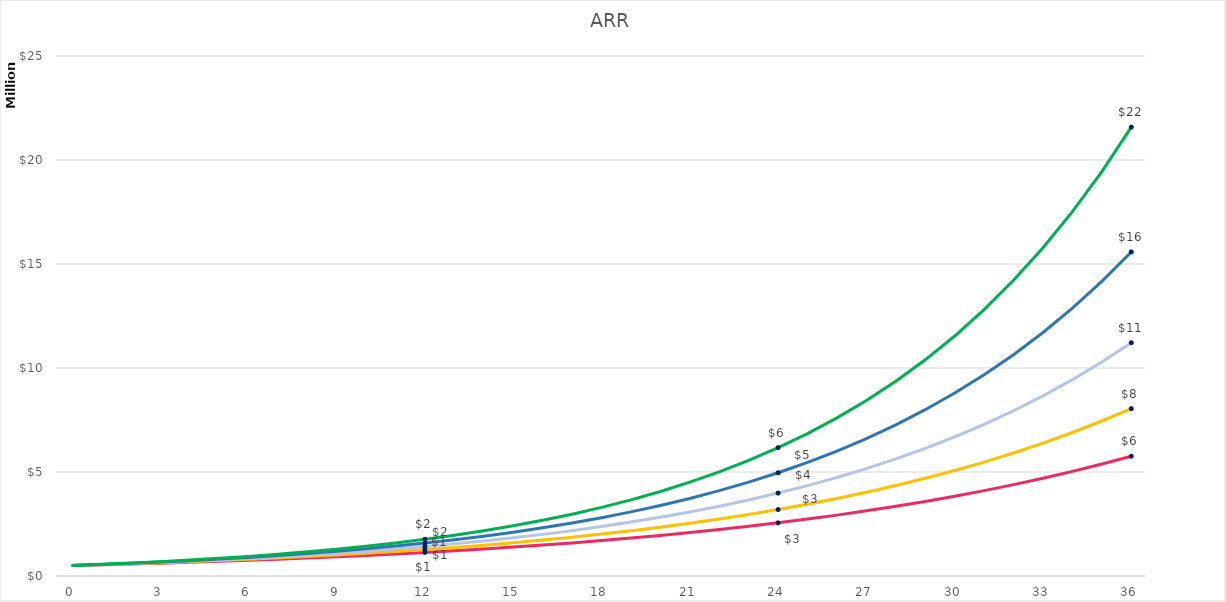
| Category | Series 1 | Series 2 | Series 0 | Series 3 | Series 4 |
|---|---|---|---|---|---|
| 0.0 | 504000 | 504000 | 504000 | 504000 | 504000 |
| 1.0 | 539280 | 544320 | 549360 | 554400 | 559440 |
| 2.0 | 577029.6 | 587865.6 | 598802.4 | 609840 | 620978.4 |
| 3.0 | 617421.672 | 634894.848 | 652694.616 | 670824 | 689286.024 |
| 4.0 | 660641.189 | 685686.436 | 711437.131 | 737906.4 | 765107.487 |
| 5.0 | 706886.072 | 740541.351 | 775466.473 | 811697.04 | 849269.31 |
| 6.0 | 756368.097 | 799784.659 | 845258.456 | 892866.744 | 942688.934 |
| 7.0 | 809313.864 | 863767.431 | 921331.717 | 982153.418 | 1046384.717 |
| 8.0 | 865965.835 | 932868.826 | 1004251.571 | 1080368.76 | 1161487.036 |
| 9.0 | 926583.443 | 1007498.332 | 1094634.213 | 1188405.636 | 1289250.61 |
| 10.0 | 991444.284 | 1088098.199 | 1193151.292 | 1307246.2 | 1431068.177 |
| 11.0 | 1060845.384 | 1175146.055 | 1300534.908 | 1437970.82 | 1588485.676 |
| 12.0 | 1135104.561 | 1269157.739 | 1417583.05 | 1581767.902 | 1763219.101 |
| 13.0 | 1214561.88 | 1370690.358 | 1545165.525 | 1739944.692 | 1957173.202 |
| 14.0 | 1299581.212 | 1480345.587 | 1684230.422 | 1913939.161 | 2172462.254 |
| 15.0 | 1390551.897 | 1598773.234 | 1835811.16 | 2105333.077 | 2411433.102 |
| 16.0 | 1487890.529 | 1726675.092 | 2001034.164 | 2315866.385 | 2676690.743 |
| 17.0 | 1592042.866 | 1864809.1 | 2181127.239 | 2547453.024 | 2971126.725 |
| 18.0 | 1703485.867 | 2013993.828 | 2377428.69 | 2802198.326 | 3297950.665 |
| 19.0 | 1822729.878 | 2175113.334 | 2591397.272 | 3082418.159 | 3660725.238 |
| 20.0 | 1950320.969 | 2349122.401 | 2824623.027 | 3390659.974 | 4063405.014 |
| 21.0 | 2086843.437 | 2537052.193 | 3078839.099 | 3729725.972 | 4510379.566 |
| 22.0 | 2232922.478 | 2740016.368 | 3355934.618 | 4102698.569 | 5006521.318 |
| 23.0 | 2389227.051 | 2959217.677 | 3657968.734 | 4512968.426 | 5557238.663 |
| 24.0 | 2556472.945 | 3195955.092 | 3987185.92 | 4964265.269 | 6168534.916 |
| 25.0 | 2735426.051 | 3451631.499 | 4346032.653 | 5460691.795 | 6847073.757 |
| 26.0 | 2926905.874 | 3727762.019 | 4737175.592 | 6006760.975 | 7600251.87 |
| 27.0 | 3131789.285 | 4025982.98 | 5163521.395 | 6607437.073 | 8436279.576 |
| 28.0 | 3351014.535 | 4348061.619 | 5628238.32 | 7268180.78 | 9364270.329 |
| 29.0 | 3585585.553 | 4695906.548 | 6134779.769 | 7994998.858 | 10394340.065 |
| 30.0 | 3836576.542 | 5071579.072 | 6686909.948 | 8794498.744 | 11537717.472 |
| 31.0 | 4105136.899 | 5477305.398 | 7288731.844 | 9673948.618 | 12806866.394 |
| 32.0 | 4392496.482 | 5915489.83 | 7944717.71 | 10641343.48 | 14215621.698 |
| 33.0 | 4699971.236 | 6388729.016 | 8659742.304 | 11705477.828 | 15779340.084 |
| 34.0 | 5028969.223 | 6899827.337 | 9439119.111 | 12876025.61 | 17515067.494 |
| 35.0 | 5380997.068 | 7451813.524 | 10288639.831 | 14163628.171 | 19441724.918 |
| 36.0 | 5757666.863 | 8047958.606 | 11214617.416 | 15579990.989 | 21580314.659 |